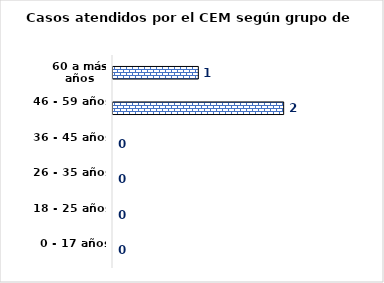
| Category | Series 0 |
|---|---|
| 0 - 17 años | 0 |
| 18 - 25 años | 0 |
| 26 - 35 años | 0 |
| 36 - 45 años | 0 |
| 46 - 59 años | 2 |
| 60 a más años | 1 |